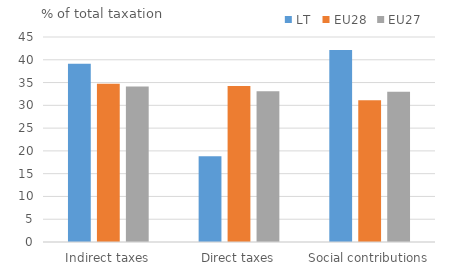
| Category | LT | EU28 | EU27 |
|---|---|---|---|
| Indirect taxes | 39.13 | 34.748 | 34.122 |
| Direct taxes | 18.81 | 34.27 | 33.09 |
| Social contributions | 42.125 | 31.135 | 32.964 |